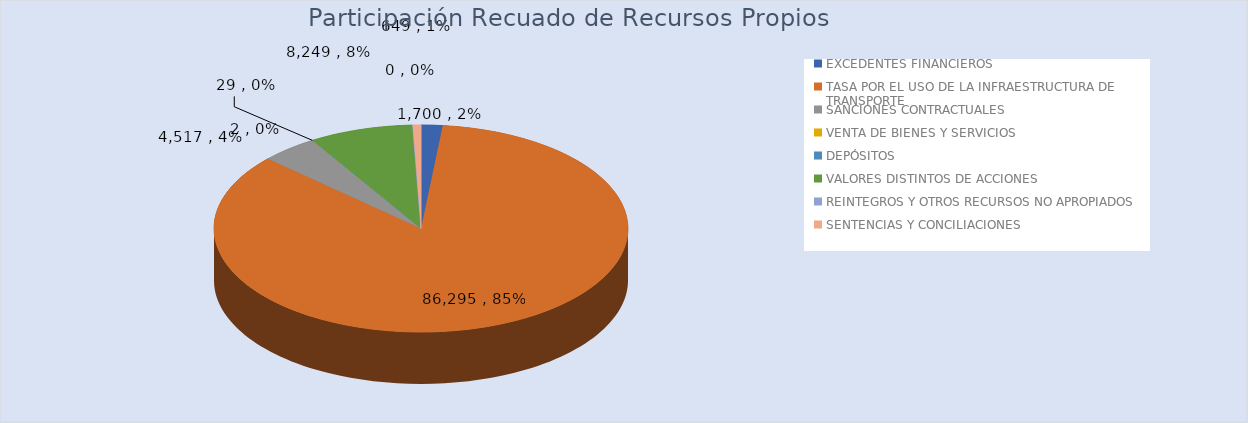
| Category | Total |
|---|---|
| EXCEDENTES FINANCIEROS | 1700 |
| TASA POR EL USO DE LA INFRAESTRUCTURA DE TRANSPORTE | 86295.233 |
| SANCIONES CONTRACTUALES | 4517 |
| VENTA DE BIENES Y SERVICIOS | 1.857 |
| DEPÓSITOS | 29.492 |
| VALORES DISTINTOS DE ACCIONES | 8249.388 |
| REINTEGROS Y OTROS RECURSOS NO APROPIADOS | 0.038 |
| SENTENCIAS Y CONCILIACIONES | 649.306 |